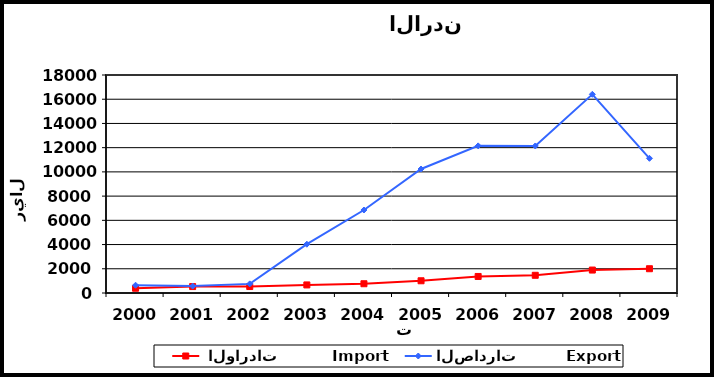
| Category |  الواردات           Import | الصادرات          Export |
|---|---|---|
| 2000.0 | 392 | 642 |
| 2001.0 | 531 | 569 |
| 2002.0 | 534 | 753 |
| 2003.0 | 667 | 4029 |
| 2004.0 | 765 | 6852 |
| 2005.0 | 1009 | 10238 |
| 2006.0 | 1365 | 12148 |
| 2007.0 | 1463 | 12139 |
| 2008.0 | 1895 | 16406 |
| 2009.0 | 2004 | 11121 |